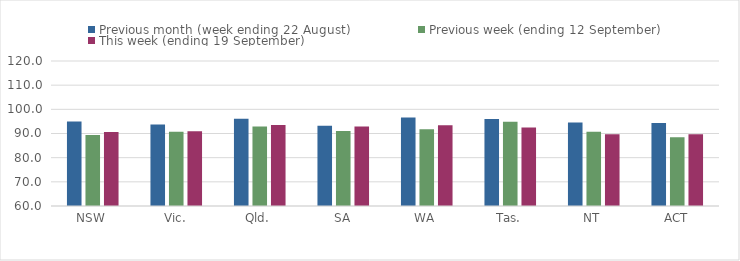
| Category | Previous month (week ending 22 August) | Previous week (ending 12 September) | This week (ending 19 September) |
|---|---|---|---|
| NSW | 94.99 | 89.35 | 90.6 |
| Vic. | 93.72 | 90.69 | 90.96 |
| Qld. | 96.13 | 92.94 | 93.53 |
| SA | 93.19 | 91.04 | 92.94 |
| WA | 96.59 | 91.77 | 93.42 |
| Tas. | 96.05 | 94.86 | 92.47 |
| NT | 94.51 | 90.72 | 89.69 |
| ACT | 94.38 | 88.47 | 89.68 |